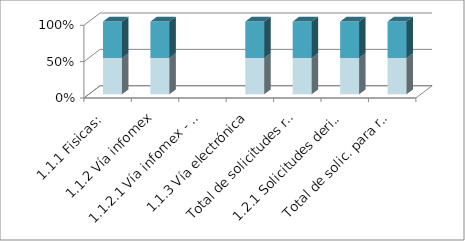
| Category | Series 3 | Series 4 | Series 5 | Series 0 | Series 1 | Series 2 |
|---|---|---|---|---|---|---|
| 1.1.1 Fisicas: |  |  | 2 |  |  | 2 |
| 1.1.2 Vía infomex |  |  | 6 |  |  | 6 |
| 1.1.2.1 Vía infomex - PNT |  |  | 0 |  |  | 0 |
| 1.1.3 Vía electrónica |  |  | 13 |  |  | 13 |
| Total de solicitudes recibidas: |  |  | 21 |  |  | 21 |
| 1.2.1 Solicitudes derivadas por incom |  |  | 1 |  |  | 1 |
| Total de solic. para resolución: |  |  | 20 |  |  | 20 |